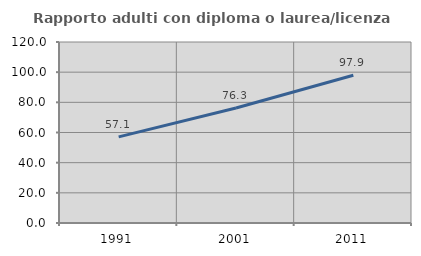
| Category | Rapporto adulti con diploma o laurea/licenza media  |
|---|---|
| 1991.0 | 57.082 |
| 2001.0 | 76.265 |
| 2011.0 | 97.941 |